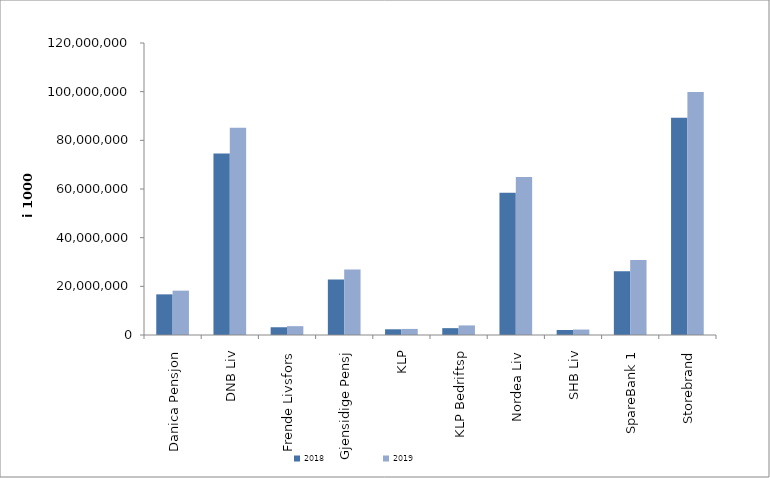
| Category | 2018 | 2019 |
|---|---|---|
| Danica Pensjon | 16706584.575 | 18231058.762 |
| DNB Liv | 74630254 | 85192428.625 |
| Frende Livsfors | 3185848 | 3631130 |
| Gjensidige Pensj | 22784107 | 26882141 |
| KLP | 2344983.741 | 2497218.774 |
| KLP Bedriftsp | 2816074 | 3934107 |
| Nordea Liv | 58443269.995 | 64970070 |
| SHB Liv | 2055445 | 2236863.361 |
| SpareBank 1 | 26221241.437 | 30793410.668 |
| Storebrand | 89292605.565 | 99882666.64 |